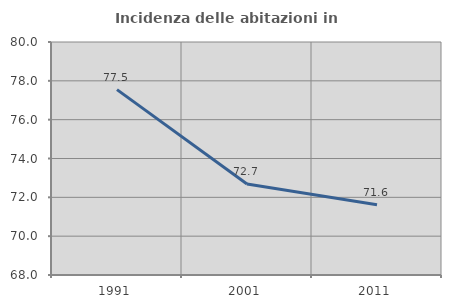
| Category | Incidenza delle abitazioni in proprietà  |
|---|---|
| 1991.0 | 77.546 |
| 2001.0 | 72.69 |
| 2011.0 | 71.622 |